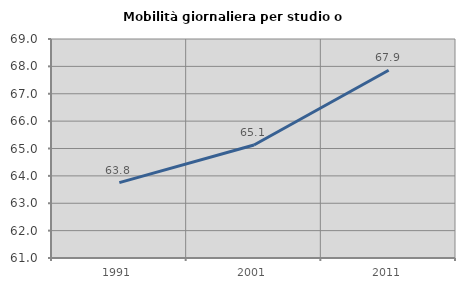
| Category | Mobilità giornaliera per studio o lavoro |
|---|---|
| 1991.0 | 63.753 |
| 2001.0 | 65.127 |
| 2011.0 | 67.86 |